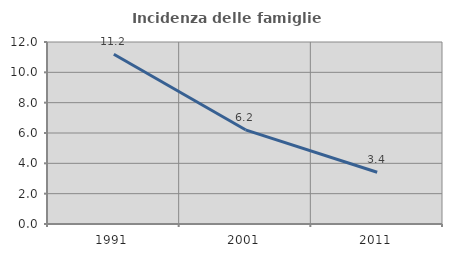
| Category | Incidenza delle famiglie numerose |
|---|---|
| 1991.0 | 11.196 |
| 2001.0 | 6.21 |
| 2011.0 | 3.414 |